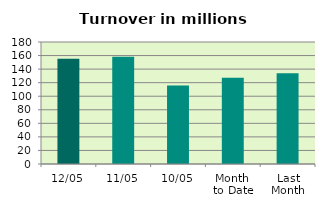
| Category | Series 0 |
|---|---|
| 12/05 | 155.278 |
| 11/05 | 158.336 |
| 10/05 | 115.978 |
| Month 
to Date | 127.16 |
| Last
Month | 133.981 |